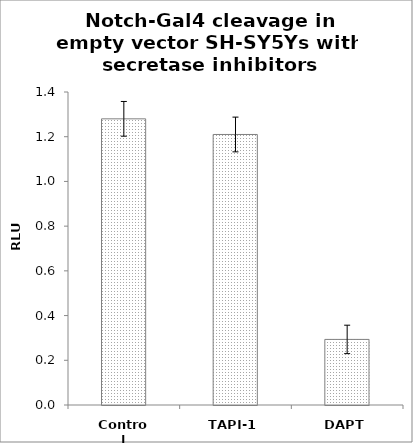
| Category | Series 0 |
|---|---|
| Control | 1.28 |
| TAPI-1 | 1.21 |
| DAPT | 0.293 |